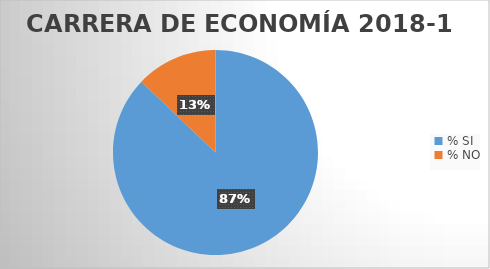
| Category | Series 0 |
|---|---|
| % SI | 77.215 |
| % NO | 11.392 |